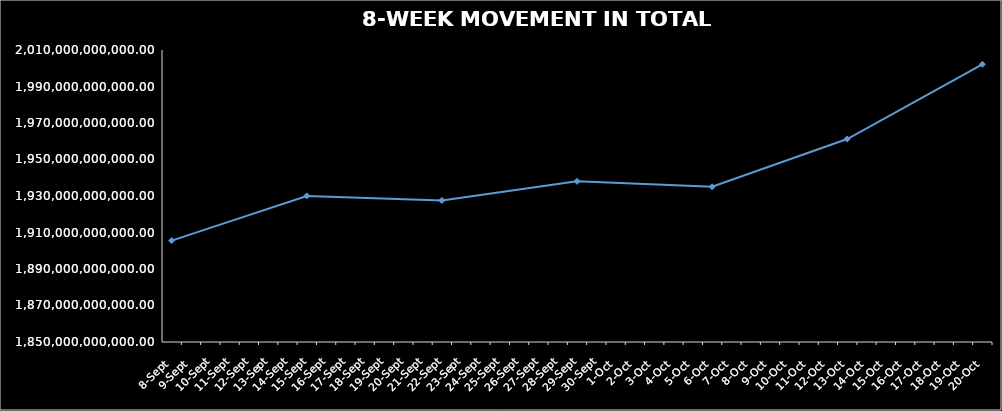
| Category | TOTAL NAV |
|---|---|
| 2023-09-08 | 1905565030169.316 |
| 2023-09-15 | 1930034404358.771 |
| 2023-09-22 | 1927585637735.849 |
| 2023-09-29 | 1938057005087.285 |
| 2023-10-06 | 1935067759050.206 |
| 2023-10-13 | 1961229345082.933 |
| 2023-10-20 | 2002190167303.245 |